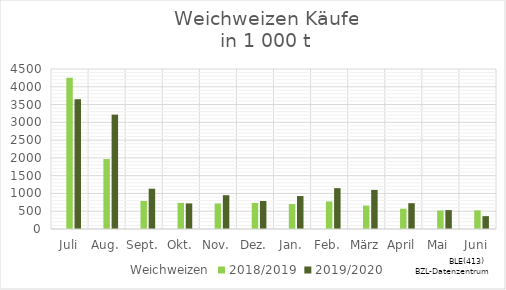
| Category | Weichweizen | 2018/2019 | 2019/2020 |
|---|---|---|---|
| Juli |  | 4250.562 | 3646.2 |
| Aug. |  | 1967.149 | 3217.139 |
| Sept. |  | 787.454 | 1132.394 |
| Okt. |  | 734.567 | 720.112 |
| Nov. |  | 718.155 | 950.372 |
| Dez. |  | 733.171 | 787.137 |
| Jan. |  | 701.742 | 927.059 |
| Feb. |  | 774.446 | 1148.812 |
| März |  | 658.679 | 1099.364 |
| April |  | 570.672 | 726.561 |
| Mai |  | 521.024 | 531.239 |
| Juni |  | 524.577 | 361.587 |